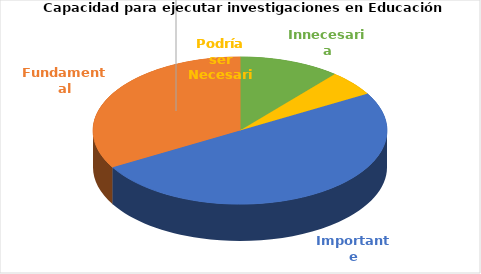
| Category | Series 0 |
|---|---|
| Innecesaria | 2 |
| Podría ser Necesaria | 1 |
| Importante | 9 |
| Fundamental | 6 |